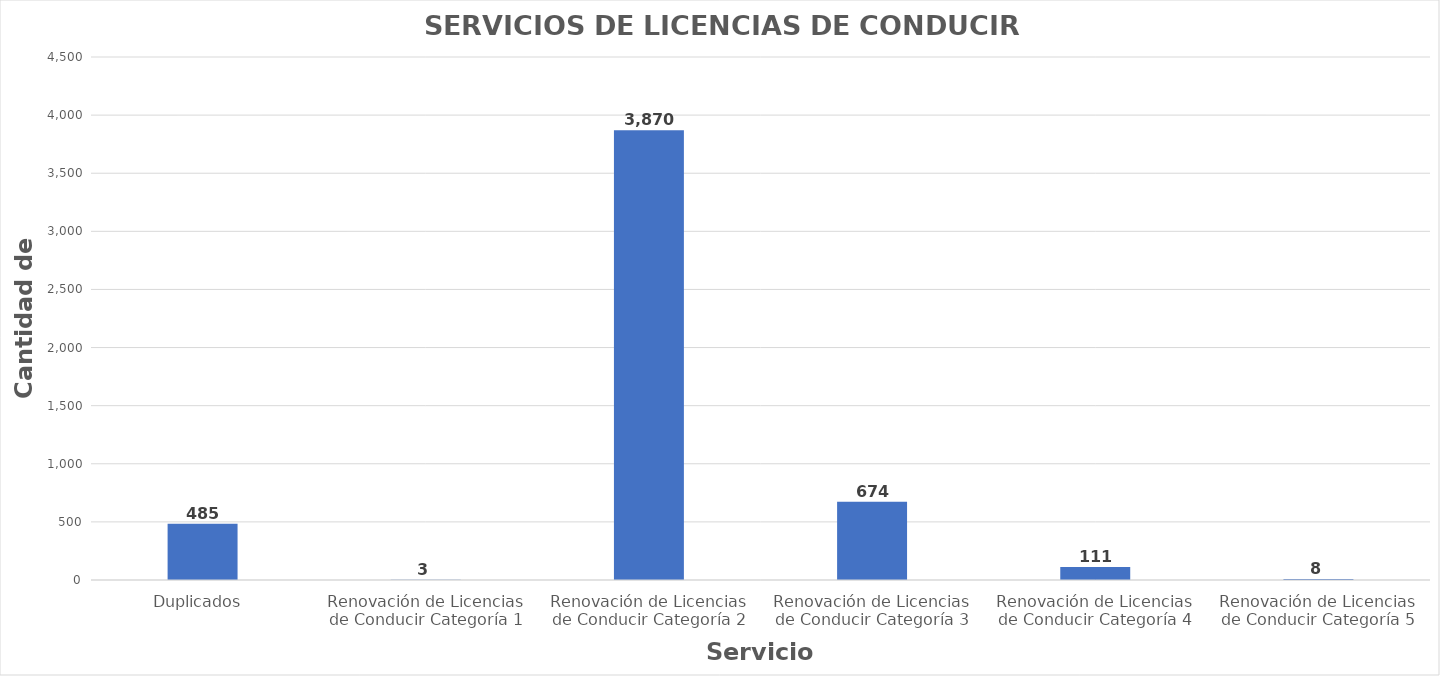
| Category | Series 0 |
|---|---|
| Duplicados  | 485 |
| Renovación de Licencias de Conducir Categoría 1 | 3 |
| Renovación de Licencias de Conducir Categoría 2 | 3870 |
| Renovación de Licencias de Conducir Categoría 3 | 674 |
| Renovación de Licencias de Conducir Categoría 4 | 111 |
| Renovación de Licencias de Conducir Categoría 5 | 8 |